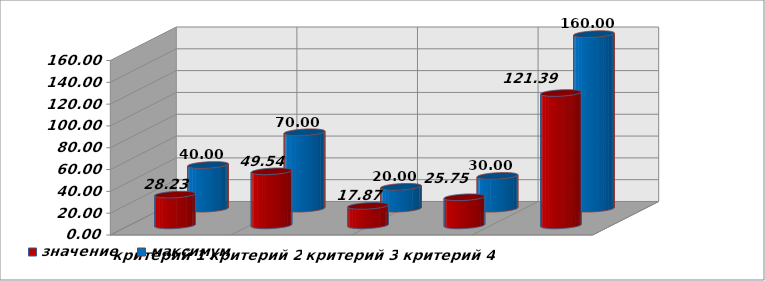
| Category | значение | максимум |
|---|---|---|
| критерий 1 | 28.23 | 40 |
| критерий 2 | 49.54 | 70 |
| критерий 3 | 17.87 | 20 |
| критерий 4 | 25.75 | 30 |